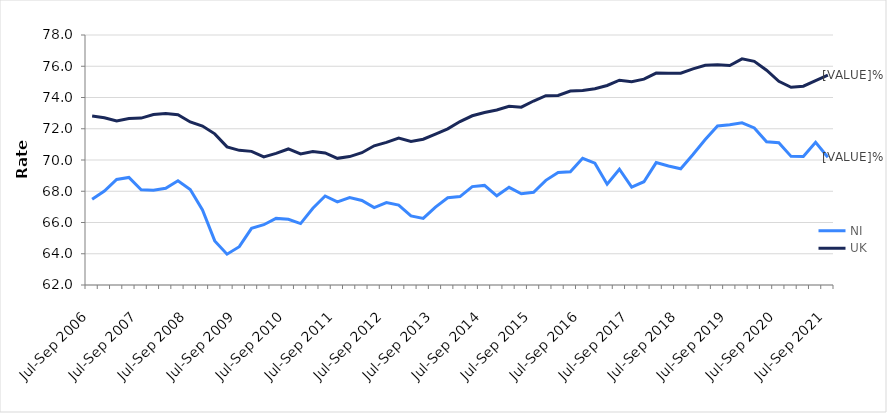
| Category | NI | UK |
|---|---|---|
| Jul-Sep 2006 | 67.483 | 72.817 |
| Oct-Dec 2006 | 68.01 | 72.707 |
| Jan-Mar 2007 | 68.751 | 72.502 |
| Apr-Jun 2007 | 68.883 | 72.651 |
| Jul-Sep 2007 | 68.091 | 72.683 |
| Oct-Dec 2007 | 68.059 | 72.909 |
| Jan-Mar 2008 | 68.193 | 72.976 |
| Apr-Jun 2008 | 68.674 | 72.9 |
| Jul-Sep 2008 | 68.114 | 72.436 |
| Oct-Dec 2008 | 66.798 | 72.174 |
| Jan-Mar 2009 | 64.822 | 71.673 |
| Apr-Jun 2009 | 63.973 | 70.84 |
| Jul-Sep 2009 | 64.453 | 70.617 |
| Oct-Dec 2009 | 65.629 | 70.552 |
| Jan-Mar 2010 | 65.858 | 70.195 |
| Apr-Jun 2010 | 66.264 | 70.423 |
| Jul-Sep 2010 | 66.205 | 70.705 |
| Oct-Dec 2010 | 65.931 | 70.39 |
| Jan-Mar 2011 | 66.913 | 70.546 |
| Apr-Jun 2011 | 67.699 | 70.45 |
| Jul-Sep 2011 | 67.317 | 70.105 |
| Oct-Dec 2011 | 67.599 | 70.218 |
| Jan-Mar 2012 | 67.412 | 70.467 |
| Apr-Jun 2012 | 66.955 | 70.908 |
| Jul-Sep 2012 | 67.271 | 71.131 |
| Oct-Dec 2012 | 67.111 | 71.404 |
| Jan-Mar 2013 | 66.421 | 71.18 |
| Apr-Jun 2013 | 66.259 | 71.332 |
| Jul-Sep 2013 | 66.99 | 71.654 |
| Oct-Dec 2013 | 67.584 | 71.994 |
| Jan-Mar 2014 | 67.657 | 72.46 |
| Apr-Jun 2014 | 68.296 | 72.83 |
| Jul-Sep 2014 | 68.375 | 73.043 |
| Oct-Dec 2014 | 67.708 | 73.203 |
| Jan-Mar 2015 | 68.249 | 73.437 |
| Apr-Jun 2015 | 67.839 | 73.383 |
| Jul-Sep 2015 | 67.93 | 73.776 |
| Oct-Dec 2015 | 68.699 | 74.112 |
| Jan-Mar 2016 | 69.205 | 74.135 |
| Apr-Jun 2016 | 69.246 | 74.417 |
| Jul-Sep 2016 | 70.107 | 74.447 |
| Oct-Dec 2016 | 69.8 | 74.566 |
| Jan-Mar 2017 | 68.449 | 74.769 |
| Apr-Jun 2017 | 69.411 | 75.104 |
| Jul-Sep 2017 | 68.262 | 75.007 |
| Oct-Dec 2017 | 68.61 | 75.175 |
| Jan-Mar 2018 | 69.833 | 75.561 |
| Apr-Jun 2018 | 69.62 | 75.549 |
| Jul-Sep 2018 | 69.441 | 75.553 |
| Oct-Dec 2018 | 70.349 | 75.833 |
| Jan-Mar 2019 | 71.307 | 76.057 |
| Apr-Jun 2019 | 72.176 | 76.102 |
| Jul-Sep 2019 | 72.253 | 76.047 |
| Oct-Dec 2019 | 72.378 | 76.471 |
| Jan-Mar 2020 | 72.055 | 76.313 |
| Apr-Jun 2020 | 71.167 | 75.748 |
| Jul-Sep 2020 | 71.11 | 75.033 |
| Oct-Dec 2020 | 70.232 | 74.654 |
| Jan-Mar 2021 | 70.218 | 74.725 |
| Apr-Jun 2021 | 71.13 | 75.072 |
| Jul-Sep 2021 | 70.18 | 75.427 |